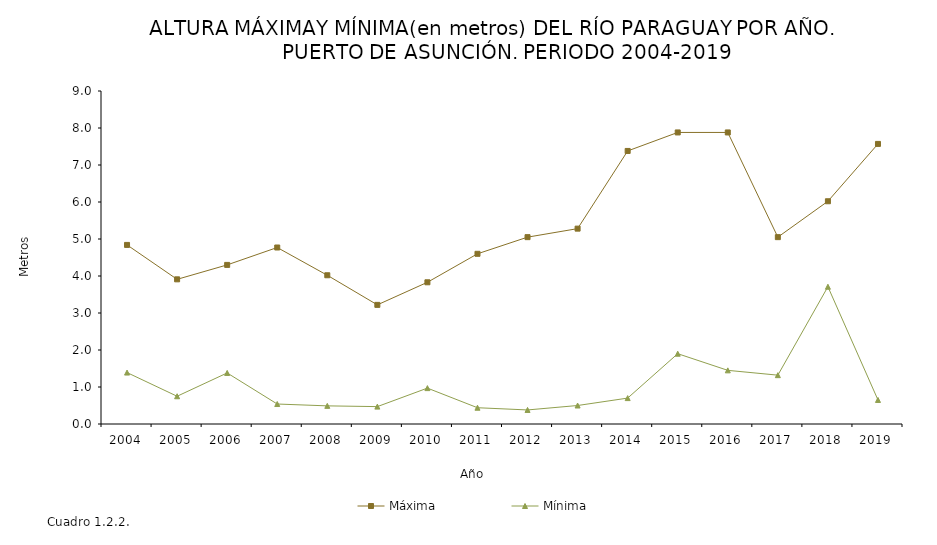
| Category | Máxima |
|---|---|
| 2004.0 | 4.84 |
| 2005.0 | 3.91 |
| 2006.0 | 4.3 |
| 2007.0 | 4.77 |
| 2008.0 | 4.02 |
| 2009.0 | 3.22 |
| 2010.0 | 3.83 |
| 2011.0 | 4.6 |
| 2012.0 | 5.05 |
| 2013.0 | 5.28 |
| 2014.0 | 7.38 |
| 2015.0 | 7.88 |
| 2016.0 | 7.88 |
| 2017.0 | 5.05 |
| 2018.0 | 6.02 |
| 2019.0 | 7.57 |